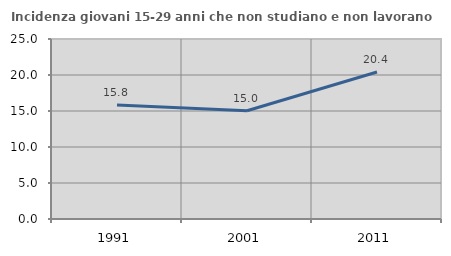
| Category | Incidenza giovani 15-29 anni che non studiano e non lavorano  |
|---|---|
| 1991.0 | 15.817 |
| 2001.0 | 15.029 |
| 2011.0 | 20.415 |